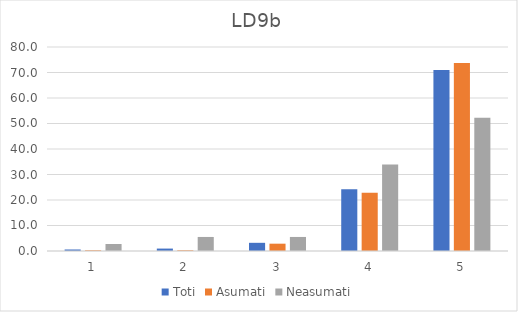
| Category | Toti | Asumati | Neasumati |
|---|---|---|---|
| 0 | 0.595 | 0.273 | 2.752 |
| 1 | 0.951 | 0.273 | 5.505 |
| 2 | 3.21 | 2.869 | 5.505 |
| 3 | 24.257 | 22.814 | 33.945 |
| 4 | 70.987 | 73.77 | 52.294 |